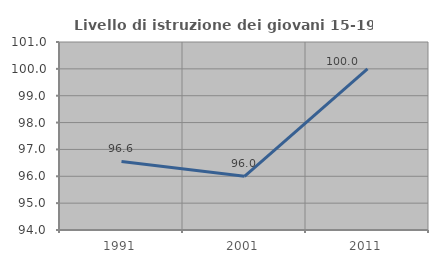
| Category | Livello di istruzione dei giovani 15-19 anni |
|---|---|
| 1991.0 | 96.552 |
| 2001.0 | 96 |
| 2011.0 | 100 |